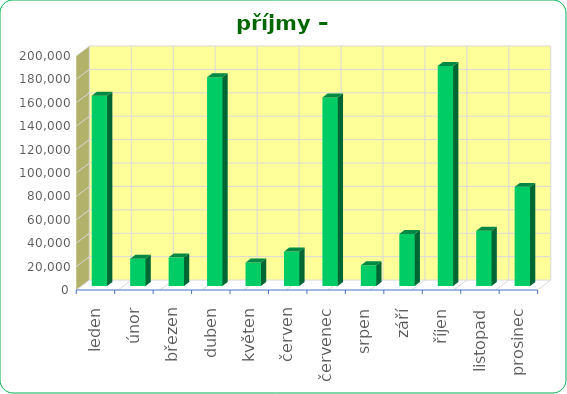
| Category | Series 0 |
|---|---|
| leden | 162600 |
| únor | 23256 |
| březen | 24460 |
| duben | 178400 |
| květen | 20020 |
| červen | 29400 |
| červenec | 161120 |
| srpen | 17680 |
| září | 44480 |
| říjen | 188060 |
| listopad | 47160 |
| prosinec | 84700 |